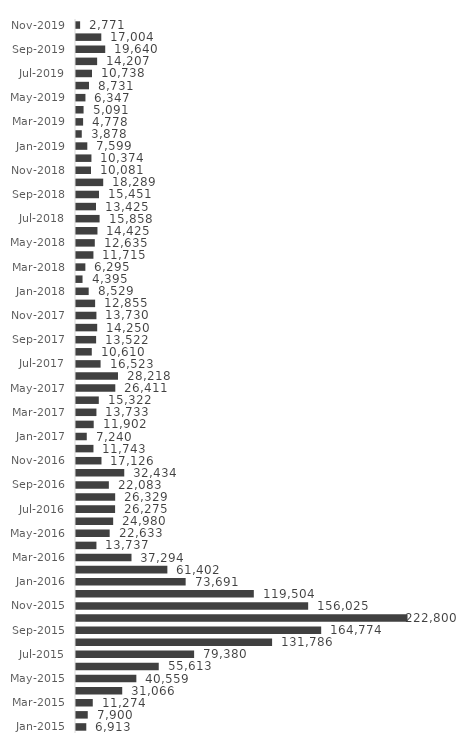
| Category | Series 0 |
|---|---|
| Jan-2015 | 6913 |
| Feb-2015 | 7900 |
| Mar-2015 | 11274 |
| Apr-2015 | 31066 |
| May-2015 | 40559 |
| Jun-2015 | 55613 |
| Jul-2015 | 79380 |
| Aug-2015 | 131786 |
| Sep-2015 | 164774 |
| Oct-2015 | 222800 |
| Nov-2015 | 156025 |
| Dec-2015 | 119504 |
| Jan-2016 | 73691 |
| Feb-2016 | 61402 |
| Mar-2016 | 37294 |
| Apr-2016 | 13737 |
| May-2016 | 22633 |
| Jun-2016 | 24980 |
| Jul-2016 | 26275 |
| Aug-2016 | 26329 |
| Sep-2016 | 22083 |
| Oct-2016 | 32434 |
| Nov-2016 | 17126 |
| Dec-2016 | 11743 |
| Jan-2017 | 7240 |
| Feb-2017 | 11902 |
| Mar-2017 | 13733 |
| Apr-2017 | 15322 |
| May-2017 | 26411 |
| Jun-2017 | 28218 |
| Jul-2017 | 16523 |
| Aug-2017 | 10610 |
| Sep-2017 | 13522 |
| Oct-2017 | 14250 |
| Nov-2017 | 13730 |
| Dec-2017 | 12855 |
| Jan-2018 | 8529 |
| Feb-2018 | 4395 |
| Mar-2018 | 6295 |
| Apr-2018 | 11715 |
| May-2018 | 12635 |
| Jun-2018 | 14425 |
| Jul-2018 | 15858 |
| Aug-2018 | 13425 |
| Sep-2018 | 15451 |
| Oct-2018 | 18289 |
| Nov-2018 | 10081 |
| Dec-2018 | 10374 |
| Jan-2019 | 7599 |
| Feb-2019 | 3878 |
| Mar-2019 | 4778 |
| Apr-2019 | 5091 |
| May-2019 | 6347 |
| Jun-2019 | 8731 |
| Jul-2019 | 10738 |
| Aug-2019 | 14207 |
| Sep-2019 | 19640 |
| Oct-2019 | 17004 |
| Nov-2019 | 2771 |